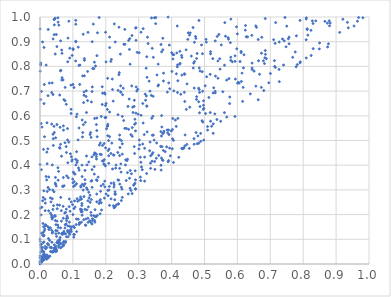
| Category | Series 0 |
|---|---|
| 0.07771794517160956 | 0.092 |
| 0.06074294028193955 | 0.086 |
| 0.6450709601239759 | 0.787 |
| 0.6847237936597033 | 0.994 |
| 0.08099568890269208 | 0.175 |
| 0.08514349919642825 | 0.915 |
| 0.025799441185664927 | 0.026 |
| 0.4145159997786562 | 0.77 |
| 0.5925951288202875 | 0.597 |
| 0.49307725375003175 | 0.778 |
| 0.24237287379751546 | 0.323 |
| 0.023870071170975865 | 0.466 |
| 0.06263583920901782 | 0.904 |
| 0.2908583154916927 | 0.304 |
| 0.24719032060894935 | 0.257 |
| 0.28681410300656623 | 0.663 |
| 0.25096911321135656 | 0.685 |
| 0.13282006722842943 | 0.18 |
| 0.8090279346385141 | 0.908 |
| 0.014582478561518585 | 0.141 |
| 0.25779008036873496 | 0.95 |
| 0.0701783342925036 | 0.087 |
| 0.061128077026876386 | 0.553 |
| 0.22933120541348714 | 0.283 |
| 0.6822958382141342 | 0.812 |
| 0.0894987998038751 | 0.133 |
| 0.2452397143179568 | 0.721 |
| 0.03910000964928657 | 0.129 |
| 0.12479755337448795 | 0.217 |
| 0.07646468307898636 | 0.715 |
| 0.04956767765553358 | 0.06 |
| 0.048104040195846506 | 0.06 |
| 0.30078739836975715 | 0.466 |
| 0.08430548199587273 | 0.134 |
| 0.010231933842358947 | 0.025 |
| 0.15475177297115605 | 0.209 |
| 0.22343150726191183 | 0.441 |
| 0.3519888541799515 | 0.998 |
| 0.013160806273815216 | 0.727 |
| 0.23974399773564367 | 0.766 |
| 0.34106295820876875 | 0.873 |
| 0.28851906456230514 | 0.586 |
| 0.15829432648563949 | 0.311 |
| 0.5326616762704381 | 0.903 |
| 0.4312412971049627 | 0.765 |
| 0.2897377193762897 | 0.304 |
| 0.3692653472762962 | 0.429 |
| 0.15427038501381404 | 0.168 |
| 0.1170654224397637 | 0.389 |
| 0.4841708892310961 | 0.794 |
| 0.7900441353425697 | 0.814 |
| 0.271873395746338 | 0.869 |
| 0.18967618542968437 | 0.417 |
| 0.10409934646162415 | 0.333 |
| 0.4441371893201989 | 0.867 |
| 0.015109716271359873 | 0.262 |
| 0.043537256314069926 | 0.532 |
| 0.042562452439769506 | 0.292 |
| 0.4883391060238307 | 0.529 |
| 0.054505547591070985 | 0.39 |
| 0.7274150226119309 | 0.738 |
| 0.22245315544635924 | 0.659 |
| 0.039840382371500775 | 0.049 |
| 0.31366859402506053 | 0.953 |
| 0.06219879855623923 | 0.782 |
| 0.18606769741198773 | 0.248 |
| 0.3343526679261407 | 0.7 |
| 0.02381402629883385 | 0.024 |
| 0.02885524253502658 | 0.301 |
| 0.19719650741495162 | 0.402 |
| 0.8659275276293782 | 0.982 |
| 0.0018122623020956376 | 0.806 |
| 0.4002992298416866 | 0.855 |
| 2.5374732099011684e-05 | 0.101 |
| 0.08206378033074815 | 0.194 |
| 0.3737629490613239 | 0.419 |
| 0.4178683884943541 | 0.694 |
| 0.18343687040565534 | 0.26 |
| 0.0018642116358527354 | 0.003 |
| 0.06232287972101107 | 0.485 |
| 0.09060662901800144 | 0.12 |
| 0.15223651508205943 | 0.524 |
| 0.24637505635666643 | 0.372 |
| 0.37357774883448897 | 0.867 |
| 0.12598466225090163 | 0.263 |
| 0.9206433246219313 | 0.991 |
| 0.09155771954819807 | 0.214 |
| 0.2401657528221085 | 0.959 |
| 0.2906225556285509 | 0.57 |
| 0.0675035561262706 | 0.12 |
| 0.13672617597431672 | 0.341 |
| 0.6080060294964591 | 0.82 |
| 0.7370790127498139 | 0.911 |
| 0.03960689348643968 | 0.189 |
| 7.24115315688472e-05 | 0.403 |
| 0.324106128229704 | 0.366 |
| 0.8791789458443146 | 0.984 |
| 0.006125430537741739 | 0.554 |
| 0.5785977053293129 | 0.896 |
| 0.2894492978625962 | 0.377 |
| 0.2057168179602708 | 0.752 |
| 0.004210188806059984 | 0.08 |
| 0.1271771722504581 | 0.237 |
| 0.3586671842119306 | 0.721 |
| 0.16540340149235583 | 0.817 |
| 0.07137053527687849 | 0.542 |
| 0.46934183696584075 | 0.898 |
| 0.2254488311588633 | 0.32 |
| 0.0005231411249484815 | 0.781 |
| 0.7272926840977211 | 0.899 |
| 0.4553046574903851 | 0.635 |
| 0.18126331389791767 | 0.256 |
| 0.0300058892932536 | 0.032 |
| 0.8121090191753233 | 0.949 |
| 0.20080228107822706 | 0.818 |
| 0.1296500424922519 | 0.762 |
| 0.04330208390071113 | 0.99 |
| 0.6198994387071352 | 0.847 |
| 0.13653140985544368 | 0.221 |
| 0.08444369235965678 | 0.187 |
| 0.24186704671824485 | 0.439 |
| 0.40673053593521075 | 0.701 |
| 0.07764218767525448 | 0.123 |
| 0.8242108388043438 | 0.844 |
| 0.09561830262548737 | 0.15 |
| 0.004297389380419186 | 0.125 |
| 0.03218062941669747 | 0.205 |
| 0.13825516684738204 | 0.158 |
| 0.03903496364241031 | 0.299 |
| 0.0800028965733332 | 0.222 |
| 0.1279884020346455 | 0.197 |
| 0.02664283043526806 | 0.352 |
| 0.031716866241943205 | 0.268 |
| 0.10016213471356948 | 0.328 |
| 0.2374117420797657 | 0.703 |
| 0.19612990590698923 | 0.693 |
| 0.5174009401749693 | 0.613 |
| 0.46969386960016785 | 0.82 |
| 0.10862762794132301 | 0.971 |
| 0.11292581491592786 | 0.264 |
| 0.3361669980736264 | 0.387 |
| 0.10833590785664052 | 0.822 |
| 0.15132836498025895 | 0.175 |
| 0.27285491856775773 | 0.912 |
| 0.10319779711345485 | 0.224 |
| 0.15597615413171464 | 0.196 |
| 0.08380756741576341 | 0.502 |
| 0.37500464162037345 | 0.46 |
| 0.5938614226923732 | 0.749 |
| 0.055206157423616405 | 0.339 |
| 0.8236639024213177 | 0.946 |
| 0.10644545556295043 | 0.231 |
| 0.3181068039094391 | 0.433 |
| 0.3414347914207417 | 0.521 |
| 0.04456926993941331 | 0.066 |
| 0.6439605885889431 | 0.926 |
| 0.48472176399185934 | 0.612 |
| 0.07508871284850069 | 0.206 |
| 0.40399216167832974 | 0.83 |
| 0.19251731370333994 | 0.417 |
| 0.10003819345801117 | 0.2 |
| 0.6740551784490632 | 0.918 |
| 0.09336883532899472 | 0.136 |
| 0.964801170223846 | 0.983 |
| 0.3123192689519532 | 0.65 |
| 0.04913064145413675 | 0.316 |
| 0.48250340611096415 | 0.489 |
| 0.9814779035953203 | 0.997 |
| 0.43615840742143763 | 0.47 |
| 0.07101780527801364 | 0.35 |
| 0.12819064020476315 | 0.583 |
| 0.29717115905028957 | 0.707 |
| 0.47613236214048976 | 0.677 |
| 0.6247787226639506 | 0.966 |
| 0.010611157695849078 | 0.464 |
| 0.6446316338678989 | 0.794 |
| 0.3911841811569122 | 0.733 |
| 0.10083537084995738 | 0.868 |
| 0.11575086013095681 | 0.502 |
| 0.5093053675043655 | 0.556 |
| 0.015772165205265185 | 0.071 |
| 0.05644807711798796 | 0.084 |
| 0.03734858977105636 | 0.401 |
| 0.36830123155332556 | 0.38 |
| 2.1956225460756277e-05 | 0.027 |
| 0.5260813339637147 | 0.692 |
| 0.0003509158156742929 | 0.952 |
| 0.010830636375857468 | 0.114 |
| 0.6111346387703305 | 0.855 |
| 0.4739069090148077 | 0.913 |
| 0.4865000542904284 | 0.781 |
| 0.0670329197145895 | 0.754 |
| 0.24308499169211994 | 0.472 |
| 0.04759355832742595 | 0.511 |
| 0.07160188909020547 | 0.078 |
| 0.20464501305793556 | 0.626 |
| 0.2183363434638222 | 0.489 |
| 0.08051135907579289 | 0.11 |
| 0.020807477952920515 | 0.453 |
| 0.4021194570625414 | 0.466 |
| 0.6732732776943541 | 0.853 |
| 0.9370346638688912 | 0.956 |
| 0.18924825179902063 | 0.646 |
| 0.16842317416753994 | 0.447 |
| 0.2765128866752045 | 0.298 |
| 0.1979017651114152 | 0.688 |
| 0.02301557472646564 | 0.081 |
| 0.08445536237500709 | 0.154 |
| 0.040336460767856304 | 0.507 |
| 0.4388830792468657 | 0.77 |
| 0.05642983371208194 | 0.375 |
| 0.26228841009396997 | 0.338 |
| 0.279652297602444 | 0.925 |
| 0.767944960997353 | 0.837 |
| 0.04793695599235579 | 0.06 |
| 0.09482414580122389 | 0.252 |
| 0.12306459633295148 | 0.222 |
| 0.3406674066369046 | 0.416 |
| 0.5314088649288196 | 0.608 |
| 0.6580467114737175 | 0.958 |
| 0.10829207894981413 | 0.424 |
| 0.24187416606751624 | 0.505 |
| 0.19691416852555263 | 0.335 |
| 0.5677339208220485 | 0.595 |
| 0.04309352765939378 | 0.929 |
| 0.06517868671534456 | 0.174 |
| 0.18544641840308343 | 0.316 |
| 0.1538935334240768 | 0.532 |
| 0.015388287265706777 | 0.035 |
| 0.1325709004054277 | 0.654 |
| 0.32442182169444095 | 0.839 |
| 0.08013944516049808 | 0.183 |
| 0.5927724209496439 | 0.843 |
| 0.10173435395399631 | 0.152 |
| 0.10507449340400443 | 0.255 |
| 0.06693698963710754 | 0.122 |
| 0.6006862736330945 | 0.732 |
| 0.07048020140221421 | 0.233 |
| 0.12729079495975895 | 0.245 |
| 0.574377510628958 | 0.75 |
| 0.12386820031689555 | 0.316 |
| 0.39205402988297255 | 0.524 |
| 0.4190261275767221 | 0.589 |
| 0.680241729604829 | 0.702 |
| 0.3383402314945183 | 0.683 |
| 0.29029467727929176 | 0.341 |
| 0.22999987020627735 | 0.388 |
| 0.0026668493744544572 | 0.078 |
| 0.11975146168474929 | 0.167 |
| 0.002036962847386162 | 0.03 |
| 0.14274974124559886 | 0.401 |
| 0.3389094077474148 | 0.996 |
| 0.026305457171633177 | 0.147 |
| 0.035315307078367754 | 0.189 |
| 0.4171074622668801 | 0.964 |
| 0.05263932648453039 | 0.239 |
| 0.03968370479523262 | 0.686 |
| 0.17128711752585712 | 0.435 |
| 0.00855999046076124 | 0.051 |
| 0.3768025334165366 | 0.537 |
| 0.03558442542253086 | 0.566 |
| 0.36916798200754375 | 0.518 |
| 0.08113478648205107 | 0.357 |
| 0.14824238068279616 | 0.291 |
| 0.024418112257541973 | 0.681 |
| 0.7132372603426024 | 0.8 |
| 0.012007694637197404 | 0.089 |
| 0.4687271495110146 | 0.712 |
| 0.2371945578878892 | 0.604 |
| 0.04737641660120812 | 0.323 |
| 0.3180648709028709 | 0.336 |
| 0.11062090282033793 | 0.596 |
| 0.001882860947912881 | 0.048 |
| 0.3938951130008635 | 0.469 |
| 0.5021227367300529 | 0.721 |
| 0.968482056604477 | 0.998 |
| 0.44482117590037334 | 0.626 |
| 0.007954586309333172 | 0.067 |
| 0.2693732026560294 | 0.905 |
| 0.37525806742564843 | 0.531 |
| 0.002320943045742654 | 0.814 |
| 0.012201323757799849 | 0.042 |
| 0.031790561618948096 | 0.146 |
| 0.1125682413464168 | 0.607 |
| 0.5727915370758041 | 0.91 |
| 0.4850494015058875 | 0.695 |
| 0.10449540056289931 | 0.148 |
| 0.18635529527164685 | 0.443 |
| 0.0015869575852850602 | 0.226 |
| 0.11868361494841545 | 0.804 |
| 0.09678969439270589 | 0.416 |
| 0.1396407298217442 | 0.182 |
| 0.03915256522482721 | 0.221 |
| 0.05232287277804262 | 0.224 |
| 0.05023398100484154 | 0.112 |
| 0.06545083872374062 | 0.436 |
| 0.18038662954279494 | 0.481 |
| 0.0027503187326733186 | 0.015 |
| 0.19927585457964897 | 0.938 |
| 0.3677004224765184 | 0.4 |
| 0.5252473310781544 | 0.831 |
| 0.46570540180810616 | 0.793 |
| 0.0708528700932216 | 0.185 |
| 0.2204477622117087 | 0.706 |
| 0.710153432725008 | 0.908 |
| 0.614113921670022 | 0.773 |
| 0.001182415211174198 | 0.002 |
| 0.3407376638436963 | 0.445 |
| 0.07661894992028548 | 0.159 |
| 0.158711493120338 | 0.9 |
| 0.32322806783023167 | 0.68 |
| 0.6881899273582819 | 0.831 |
| 0.002310601845919211 | 0.004 |
| 0.06244398836361253 | 0.146 |
| 0.2658363673711462 | 0.37 |
| 0.005792793921394584 | 0.057 |
| 0.09781200738711203 | 0.844 |
| 0.3695691089118436 | 0.601 |
| 0.09053826185036062 | 0.834 |
| 0.20710655891081048 | 0.459 |
| 0.10855006028063127 | 0.902 |
| 0.1724819898294946 | 0.54 |
| 0.07943439753795564 | 0.162 |
| 0.36674108010016326 | 0.476 |
| 0.44691022009314735 | 0.729 |
| 0.08424248877955116 | 0.819 |
| 0.3396700845579861 | 0.59 |
| 0.023888543582625762 | 0.082 |
| 0.19008756767183305 | 0.48 |
| 0.27636360180613195 | 0.524 |
| 0.3601974106100851 | 0.725 |
| 0.004277538123667442 | 0.699 |
| 0.5327391553033922 | 0.693 |
| 0.6728030859986747 | 0.715 |
| 0.4059175273896763 | 0.411 |
| 0.5639460225254056 | 0.922 |
| 0.17133655840627923 | 0.565 |
| 0.39083680563365375 | 0.419 |
| 0.3364763418253606 | 0.438 |
| 0.009590725160732883 | 0.036 |
| 0.08413260000874671 | 0.136 |
| 0.5616720754593398 | 0.977 |
| 0.3445739442457565 | 0.522 |
| 0.35554192924021555 | 0.765 |
| 0.14570494529857686 | 0.256 |
| 0.15730177923077188 | 0.338 |
| 0.5046181448121406 | 0.91 |
| 0.5216811052285291 | 0.558 |
| 0.06275095617654923 | 0.081 |
| 0.0006177194400481178 | 0.033 |
| 0.1459197156321001 | 0.938 |
| 0.01006639610400599 | 0.128 |
| 0.20469670067822687 | 0.558 |
| 0.9108456967535148 | 0.938 |
| 0.18630671765259224 | 0.597 |
| 0.0033167154239257903 | 0.199 |
| 0.10859946146851626 | 0.986 |
| 0.39874318964012617 | 0.538 |
| 0.5031917847507708 | 0.609 |
| 0.006286656227087256 | 0.013 |
| 0.4681431359787495 | 0.508 |
| 0.3480162705677375 | 0.997 |
| 0.754963217511804 | 0.912 |
| 0.5172764385898274 | 0.768 |
| 0.02047363475848553 | 0.067 |
| 0.42569713199924275 | 0.812 |
| 0.15826047483935188 | 0.162 |
| 0.1953795829755433 | 0.423 |
| 0.07718266794911194 | 0.086 |
| 0.38044650475343894 | 0.455 |
| 0.2818084469272457 | 0.635 |
| 0.15533752675658324 | 0.335 |
| 0.0979767980758001 | 0.422 |
| 0.27379218326828586 | 0.307 |
| 0.02616665782120028 | 0.077 |
| 0.4307575732921429 | 0.468 |
| 0.19394406761097127 | 0.405 |
| 0.007130243457437693 | 0.013 |
| 0.03635738118504258 | 0.088 |
| 0.4943652860746295 | 0.699 |
| 0.750095659228512 | 0.963 |
| 0.21139702962002188 | 0.237 |
| 0.04956736885271304 | 0.929 |
| 0.5387602286688308 | 0.921 |
| 0.1276281326482849 | 0.4 |
| 0.2367201038428579 | 0.341 |
| 0.1798438242911299 | 0.998 |
| 0.6121628002972801 | 0.739 |
| 0.13383400423862551 | 0.683 |
| 0.08994404444164524 | 0.152 |
| 0.6183828723483474 | 0.794 |
| 0.1377091511440892 | 0.574 |
| 0.02094342356958703 | 0.037 |
| 0.6115345238896164 | 0.861 |
| 0.35353025038249464 | 0.428 |
| 0.4008927116089785 | 0.78 |
| 0.02150887210285034 | 0.026 |
| 0.17370818681036845 | 0.338 |
| 0.16876991245213635 | 0.801 |
| 0.25815845965627915 | 0.889 |
| 0.2605194993014375 | 0.422 |
| 0.013623359495657968 | 0.515 |
| 0.2918226608960388 | 0.905 |
| 0.38930390871741877 | 0.414 |
| 0.27993215148678025 | 0.285 |
| 0.12049663628603197 | 0.259 |
| 0.25298857815507736 | 0.712 |
| 0.47752360205844974 | 0.852 |
| 0.5183685190682834 | 0.851 |
| 0.15827547967998926 | 0.382 |
| 0.1603054674950383 | 0.791 |
| 0.065915660023578 | 0.866 |
| 0.3051837495414174 | 0.352 |
| 0.532257331373567 | 0.699 |
| 0.2392323506243427 | 0.339 |
| 0.04886161227397606 | 0.071 |
| 0.3864293717717975 | 0.543 |
| 0.37334130415812217 | 0.914 |
| 0.394417893238924 | 0.71 |
| 0.12084297454838465 | 0.727 |
| 0.010036108628372212 | 0.087 |
| 0.48216418299729835 | 0.712 |
| 0.10151052564545779 | 0.372 |
| 0.0628160331855416 | 0.065 |
| 0.09256082872366876 | 0.446 |
| 0.41402518505337016 | 0.557 |
| 0.07577889654491755 | 0.146 |
| 0.0511606338063712 | 0.086 |
| 0.2721524591648492 | 0.347 |
| 0.2779667709768717 | 0.365 |
| 0.8735427014526274 | 0.975 |
| 0.5797582617497172 | 0.825 |
| 0.19493897845553482 | 0.488 |
| 0.7445439056338101 | 0.998 |
| 0.027099313090699698 | 0.139 |
| 0.3072521027185678 | 0.602 |
| 0.10269275082513901 | 0.109 |
| 0.7819531038046406 | 0.807 |
| 0.38715791820731554 | 0.696 |
| 0.3591895150233644 | 0.809 |
| 0.023641265340301608 | 0.027 |
| 0.015729962247981313 | 0.216 |
| 0.007344667710516202 | 0.028 |
| 0.1090885004254288 | 0.401 |
| 0.011308022804807576 | 0.05 |
| 0.046185915309084426 | 0.995 |
| 0.017173005357230455 | 0.063 |
| 0.08770856821086806 | 0.494 |
| 0.1335409587731364 | 0.273 |
| 0.2543335452948726 | 0.581 |
| 0.418186157477565 | 0.806 |
| 0.04786552611967513 | 0.136 |
| 0.14421107532982946 | 0.301 |
| 0.3709462509531298 | 0.475 |
| 0.30493899855412404 | 0.432 |
| 0.8091641069961839 | 0.834 |
| 0.24743309115923678 | 0.5 |
| 0.018741527818379407 | 0.805 |
| 0.16464189005262 | 0.394 |
| 0.8095380233128914 | 0.997 |
| 0.16734244004707835 | 0.22 |
| 0.23875505998961005 | 0.243 |
| 0.3198048710864735 | 0.688 |
| 0.2829558441665148 | 0.613 |
| 0.7571170368931337 | 0.892 |
| 0.012156060842010015 | 0.649 |
| 0.4251885791615429 | 0.81 |
| 0.10048102809559832 | 0.872 |
| 0.6834611204954248 | 0.835 |
| 0.040548014160819386 | 0.48 |
| 0.16682012101348814 | 0.169 |
| 0.16641039008139855 | 0.45 |
| 0.009011329857562327 | 0.032 |
| 0.28865674653485074 | 0.327 |
| 0.056951522782292624 | 0.076 |
| 0.10900603874832372 | 0.9 |
| 0.2673582374892439 | 0.638 |
| 0.010771208396857832 | 0.016 |
| 0.5438558909545138 | 0.929 |
| 0.1264840231394486 | 0.22 |
| 0.13489334805501313 | 0.762 |
| 0.509333759003949 | 0.542 |
| 0.03731146843656649 | 0.264 |
| 0.35157208412652763 | 0.973 |
| 0.1062851746056243 | 0.364 |
| 0.4971733229444658 | 0.661 |
| 0.04369411279314922 | 0.078 |
| 0.16206200549898364 | 0.971 |
| 0.6789699605222785 | 0.823 |
| 0.5673628406573615 | 0.745 |
| 0.10186043954567124 | 0.314 |
| 0.3061682854899739 | 0.338 |
| 0.07029654663101609 | 0.745 |
| 0.001921518805181339 | 0.666 |
| 0.12814298849016292 | 0.354 |
| 0.11847088605269912 | 0.551 |
| 0.01203139367520658 | 0.016 |
| 0.24722322829192064 | 0.311 |
| 0.2442482866936793 | 0.85 |
| 0.02937964392033377 | 0.095 |
| 0.7125608848230843 | 0.823 |
| 0.31354135944484207 | 0.571 |
| 0.8304907237382896 | 0.872 |
| 0.06471972007108047 | 0.216 |
| 0.3179578113017107 | 0.469 |
| 0.3084905671203656 | 0.393 |
| 0.1286842096266799 | 0.323 |
| 0.17423503177424596 | 0.197 |
| 0.17175979702789024 | 0.425 |
| 0.1553453680472996 | 0.513 |
| 0.20601758317579966 | 0.559 |
| 4.888593798495144e-05 | 0 |
| 0.6642870934849785 | 0.823 |
| 0.441057693469153 | 0.522 |
| 0.18709637079953884 | 0.219 |
| 0.8299792209409124 | 0.974 |
| 0.2908289374770257 | 0.955 |
| 0.1461468778220493 | 0.169 |
| 0.17964250460362488 | 0.245 |
| 0.5409362413162245 | 0.752 |
| 0.2902854259664548 | 0.539 |
| 0.14582386168025377 | 0.185 |
| 0.4939474585247001 | 0.851 |
| 0.23122219445679174 | 0.401 |
| 0.25031679230403475 | 0.598 |
| 0.6671912077585455 | 0.768 |
| 0.5462169178438161 | 0.831 |
| 0.390707770923385 | 0.542 |
| 0.18406878592119652 | 0.294 |
| 0.21177609010418977 | 0.615 |
| 0.056894176770595814 | 0.125 |
| 0.7758029871921653 | 0.859 |
| 0.6054592962665665 | 0.732 |
| 0.4114839202110374 | 0.583 |
| 0.14145455306309607 | 0.308 |
| 0.20618432088484853 | 0.566 |
| 0.05087974334381143 | 0.052 |
| 0.051533972173124706 | 0.565 |
| 0.14134253865075005 | 0.613 |
| 0.6955007303417937 | 0.734 |
| 0.5056325882450925 | 0.898 |
| 0.49639880679697695 | 0.626 |
| 0.04258025079346173 | 0.557 |
| 0.3253721871894396 | 0.756 |
| 0.07788572300393982 | 0.209 |
| 0.13685973542741742 | 0.379 |
| 0.2865456780507758 | 0.475 |
| 0.46010230660319207 | 0.842 |
| 0.6508394232530778 | 0.781 |
| 0.49255107790418484 | 0.58 |
| 0.22797398895525942 | 0.292 |
| 0.2272850605301466 | 0.26 |
| 0.2058854583707813 | 0.52 |
| 0.6446388560394019 | 0.813 |
| 0.0370260167041533 | 0.733 |
| 0.06075786627220264 | 0.468 |
| 0.468449524405411 | 0.485 |
| 0.09949294910523784 | 0.344 |
| 0.334672442936964 | 0.494 |
| 0.0430024081878139 | 0.065 |
| 0.04355458384784078 | 0.968 |
| 0.615875492275342 | 0.658 |
| 0.006026449407181157 | 0.014 |
| 0.257884461367537 | 0.549 |
| 0.2804206211385586 | 0.552 |
| 0.20691521146203085 | 0.277 |
| 0.08039384199707911 | 0.451 |
| 0.0002083543016196539 | 0.006 |
| 0.007947680526550288 | 0.256 |
| 0.3121819045832866 | 0.486 |
| 0.6559478540786324 | 0.964 |
| 0.14928887154008105 | 0.267 |
| 0.059444934973806325 | 0.239 |
| 0.13128600816654118 | 0.93 |
| 0.04120814314640181 | 0.236 |
| 0.20095539006121024 | 0.65 |
| 0.043137313991045305 | 0.99 |
| 0.17168184455827112 | 0.341 |
| 0.16342021255722491 | 0.196 |
| 0.04649792613327757 | 0.327 |
| 0.4304098004329754 | 0.844 |
| 0.6631805996321114 | 0.909 |
| 0.25967048461445263 | 0.401 |
| 0.15617445808654443 | 0.261 |
| 0.06704192564451958 | 0.853 |
| 0.20220760556746464 | 0.547 |
| 0.8800461772341079 | 0.964 |
| 0.04472679813989335 | 0.196 |
| 0.19884258489309026 | 0.397 |
| 0.06900020426882586 | 0.315 |
| 0.09440636399533536 | 0.61 |
| 0.2920360759413662 | 0.957 |
| 0.024860212423049668 | 0.95 |
| 0.01649908916882606 | 0.158 |
| 0.27381600034351156 | 0.809 |
| 0.32435179966786204 | 0.639 |
| 0.09388352638521831 | 0.141 |
| 0.16746331565057676 | 0.192 |
| 0.12825692389429807 | 0.211 |
| 0.11118372947095977 | 0.325 |
| 0.18321337378970254 | 0.49 |
| 0.2548728684847286 | 0.89 |
| 0.14723305300595776 | 0.231 |
| 0.8820319648173969 | 0.976 |
| 0.01224150351539356 | 0.877 |
| 0.07945403032561987 | 0.475 |
| 0.513173192516932 | 0.674 |
| 0.3962358752112522 | 0.438 |
| 0.9344496289125779 | 0.978 |
| 0.2845706949742714 | 0.319 |
| 0.4970959749965678 | 0.643 |
| 0.08450977176136032 | 0.13 |
| 0.2162213017182207 | 0.327 |
| 0.34454015246522257 | 0.837 |
| 0.2501179172444035 | 0.27 |
| 0.42523906550449175 | 0.861 |
| 0.20002329256666768 | 0.594 |
| 0.32560984451206065 | 0.535 |
| 0.23792340635777032 | 0.244 |
| 0.1971852710138026 | 0.312 |
| 0.5065373927515986 | 0.758 |
| 0.7162418651697834 | 0.977 |
| 0.2922678422941008 | 0.717 |
| 0.21154402860523897 | 0.919 |
| 0.31689150557558093 | 0.524 |
| 0.7003781223241058 | 0.771 |
| 0.009078533059155952 | 0.164 |
| 0.2861689570594426 | 0.638 |
| 0.07252344560712334 | 0.121 |
| 0.024459581597588192 | 0.029 |
| 0.23645896507713474 | 0.452 |
| 0.028570980250113086 | 0.732 |
| 0.2914699767614594 | 0.611 |
| 0.14240803580221717 | 0.219 |
| 0.05141810920449669 | 0.88 |
| 0.3070794931928186 | 0.939 |
| 0.2100791299255372 | 0.466 |
| 0.5377097017300412 | 0.585 |
| 0.1444711028241662 | 0.662 |
| 0.03574363547323778 | 0.136 |
| 0.19024243711438812 | 0.691 |
| 0.33331170553056544 | 0.459 |
| 0.15949215667678757 | 0.183 |
| 0.17152310928189768 | 0.444 |
| 0.05172906889722762 | 0.174 |
| 0.4279284742766919 | 0.687 |
| 0.17230762541476705 | 0.283 |
| 0.07990369383959432 | 0.647 |
| 0.014632963651219914 | 0.032 |
| 0.03988898064392213 | 0.911 |
| 0.2420867587271064 | 0.522 |
| 0.37519343177205544 | 0.741 |
| 0.8741970376864797 | 0.879 |
| 0.10420677102574351 | 0.367 |
| 0.0027078639819382144 | 0.005 |
| 0.21174447389750997 | 0.876 |
| 0.07111020397941765 | 0.559 |
| 0.1957378858468897 | 0.267 |
| 0.3674135854408645 | 0.536 |
| 0.2094783051437657 | 0.299 |
| 0.5183857467621199 | 0.86 |
| 0.0013323289411841176 | 0.005 |
| 0.4977101688392451 | 0.502 |
| 0.08553611696659152 | 0.11 |
| 0.8118507888343266 | 0.952 |
| 0.1579984909703466 | 0.434 |
| 0.27880748814033746 | 0.721 |
| 0.08864213218589613 | 0.232 |
| 0.1413802245538494 | 0.437 |
| 0.3108802150906864 | 0.382 |
| 0.11476716634472556 | 0.254 |
| 0.0006268279357792042 | 0.092 |
| 0.2197210475388443 | 0.749 |
| 0.4949859652880272 | 0.575 |
| 0.017120244759704407 | 0.062 |
| 0.027968560837497578 | 0.032 |
| 0.36787255665266544 | 0.889 |
| 0.20626273459832328 | 0.298 |
| 0.593236008345691 | 0.82 |
| 0.418988983668842 | 0.742 |
| 0.04834705425419277 | 0.123 |
| 0.0598756031971469 | 0.684 |
| 0.7905314425343127 | 0.986 |
| 0.47795148384449526 | 0.487 |
| 0.3880341088721999 | 0.531 |
| 0.4406747286950369 | 0.478 |
| 0.04701444592537956 | 0.351 |
| 0.17382708357887613 | 0.515 |
| 0.0721893445839145 | 0.091 |
| 0.07271027667586417 | 0.666 |
| 0.8768274030971827 | 0.892 |
| 0.480002217460941 | 0.518 |
| 0.8090227143842484 | 0.992 |
| 0.3227625344938024 | 0.793 |
| 0.006626547492751786 | 0.019 |
| 0.03211967477959297 | 0.05 |
| 0.08359374480501564 | 0.548 |
| 0.47565661053945113 | 0.666 |
| 0.3732913559470281 | 0.528 |
| 0.06632695866272686 | 0.745 |
| 0.40562340893086934 | 0.501 |
| 0.010922915147900683 | 0.15 |
| 0.6023556967124919 | 0.736 |
| 0.06296549593807338 | 0.27 |
| 0.06970606315645829 | 0.313 |
| 0.576831882849333 | 0.676 |
| 0.13998451213474486 | 0.678 |
| 0.021690182457683758 | 0.406 |
| 0.002143986674723021 | 0.005 |
| 0.024400801965258463 | 0.31 |
| 0.8498960068477116 | 0.895 |
| 0.054544881501608064 | 0.997 |
| 0.24602276594238082 | 0.696 |
| 0.03549816105377673 | 0.694 |
| 0.010076574185618366 | 0.032 |
| 0.19938354593334598 | 0.47 |
| 0.13119632709869172 | 0.299 |
| 0.32512078652663023 | 0.64 |
| 0.08764611812852763 | 0.983 |
| 0.08927637580184268 | 0.169 |
| 0.08862844552435024 | 0.125 |
| 0.5491633827560145 | 0.578 |
| 0.34685984107100243 | 0.502 |
| 0.03959222153822068 | 0.525 |
| 0.4462765067149399 | 0.484 |
| 0.3267214724649325 | 0.918 |
| 0.42192716895257926 | 0.432 |
| 0.12086845981567237 | 0.165 |
| 0.4864688449952069 | 0.637 |
| 0.017421889111350775 | 0.158 |
| 0.34935334115174166 | 0.383 |
| 0.439980657557371 | 0.658 |
| 0.7785703351529347 | 0.799 |
| 0.09456863950932654 | 0.626 |
| 0.19926370389247094 | 0.593 |
| 0.06979565379273843 | 0.125 |
| 0.020224617940873057 | 0.34 |
| 0.016285640647113513 | 0.247 |
| 0.03688937301763747 | 0.125 |
| 0.1318206810265922 | 0.564 |
| 0.9546206959055893 | 0.964 |
| 0.5281030329298216 | 0.713 |
| 0.0947949757560995 | 0.131 |
| 0.4338398078870862 | 0.466 |
| 0.7911743109371341 | 0.818 |
| 0.5763698150473784 | 0.649 |
| 0.3893644660094015 | 1 |
| 0.08592217327257796 | 0.349 |
| 0.05955054497973205 | 0.096 |
| 0.01539151826490772 | 0.031 |
| 0.33582627673271837 | 0.408 |
| 0.15903057614489385 | 0.717 |
| 0.10341147390533069 | 0.714 |
| 0.5408028119434098 | 0.822 |
| 0.018878854404603733 | 0.024 |
| 0.8141489683928976 | 0.927 |
| 0.11235487441035473 | 0.411 |
| 0.2941827557278421 | 0.7 |
| 0.4374690763291214 | 0.47 |
| 0.018622997143549803 | 0.354 |
| 0.3703592002906653 | 0.555 |
| 0.40281236337157994 | 0.507 |
| 0.5719100852775149 | 0.916 |
| 0.4885118219636524 | 0.497 |
| 0.3317351994863942 | 0.74 |
| 0.1636106946033059 | 0.791 |
| 0.7403203725239267 | 0.806 |
| 0.17092163796055204 | 0.192 |
| 0.45669522096247744 | 0.936 |
| 0.003561338042186029 | 0.005 |
| 0.09537483964796793 | 0.434 |
| 0.22785752127620248 | 0.282 |
| 0.2160334464635424 | 0.264 |
| 0.022056053444924107 | 0.294 |
| 0.06334458496776717 | 0.784 |
| 0.1655263752539711 | 0.177 |
| 0.07599123810770014 | 0.661 |
| 0.3849755740623128 | 0.474 |
| 0.04657691074144631 | 0.176 |
| 0.03539047742625566 | 0.198 |
| 0.21521182252759857 | 0.82 |
| 0.16610726320769723 | 0.589 |
| 0.008578794540171814 | 0.115 |
| 0.24214011612724806 | 0.387 |
| 0.8382156824738513 | 0.984 |
| 0.5332808831404461 | 0.761 |
| 0.1766145996837891 | 0.352 |
| 0.5846756047613381 | 0.819 |
| 0.2245214302019639 | 0.329 |
| 0.43137111262185546 | 0.836 |
| 0.08897197297521342 | 0.263 |
| 0.07583131133682963 | 0.491 |
| 0.2876428200664537 | 0.447 |
| 0.21151290499958225 | 0.516 |
| 0.12581779664409798 | 0.169 |
| 0.038238026545898016 | 0.048 |
| 0.009742140764089153 | 0.27 |
| 0.021259816915687416 | 0.572 |
| 0.23173432427967944 | 0.239 |
| 0.15209680761657418 | 0.278 |
| 0.052896133413947076 | 0.088 |
| 0.005760253498234499 | 0.23 |
| 0.14073905245366214 | 0.701 |
| 0.10253174817468359 | 0.12 |
| 0.5972827977340764 | 0.96 |
| 0.012162298284649034 | 0.117 |
| 0.2286003115281709 | 0.899 |
| 0.32093179322898036 | 0.663 |
| 0.6391885250918032 | 0.689 |
| 0.26439605167262686 | 0.419 |
| 0.726730940377576 | 0.788 |
| 0.3720339832513727 | 0.422 |
| 0.013104604304221943 | 0.135 |
| 0.684742323743084 | 0.864 |
| 0.19775119258364438 | 0.592 |
| 0.47422513952212964 | 0.532 |
| 0.6632988902505766 | 0.665 |
| 0.3431615844935508 | 0.598 |
| 0.05502038932896822 | 0.979 |
| 0.47250427052141675 | 0.921 |
| 0.4979016181074737 | 0.63 |
| 0.24902746059451483 | 0.303 |
| 0.4067681004642533 | 0.847 |
| 0.3286651297349466 | 0.893 |
| 0.20060858408954338 | 0.284 |
| 0.1349814266571296 | 0.832 |
| 0.04842903709682764 | 0.159 |
| 0.019503640840608613 | 0.02 |
| 0.5980105058291512 | 0.871 |
| 0.09408749292208153 | 0.724 |
| 0.2693343220571506 | 0.545 |
| 0.295410615153255 | 0.857 |
| 0.05953307987179751 | 0.472 |
| 0.2864809509080025 | 0.322 |
| 0.11121961792052541 | 0.455 |
| 0.4538541844675993 | 0.468 |
| 0.6561975407963698 | 0.72 |
| 0.48394333804377276 | 0.706 |
| 0.2156045124320024 | 0.448 |
| 0.8278102478314014 | 0.984 |
| 0.30274690829635925 | 0.482 |
| 0.12439757983344735 | 0.311 |
| 0.375578096583402 | 0.773 |
| 0.19909610721293705 | 0.642 |
| 0.21712555823380925 | 0.828 |
| 0.01902665302689464 | 0.027 |
| 0.15243121697556417 | 0.249 |
| 0.033798250082503443 | 0.068 |
| 0.2106896855769904 | 0.314 |
| 0.580221216396357 | 0.991 |
| 0.6175308379746175 | 0.715 |
| 0.5556798052979727 | 0.697 |
| 0.1187997503068347 | 0.16 |
| 0.6310292954343325 | 0.919 |
| 0.560467828006366 | 0.613 |
| 0.5184967935993152 | 0.578 |
| 0.026294828539216067 | 0.215 |
| 0.3696006482941181 | 0.859 |
| 0.4038077717412853 | 0.848 |
| 0.25012795957702444 | 0.445 |
| 0.11138955243793251 | 0.131 |
| 0.034820729208020526 | 0.065 |
| 0.002133988495490231 | 0.077 |
| 0.848993715653067 | 0.871 |
| 0.033404682841662356 | 0.251 |
| 0.44924651570536595 | 0.91 |
| 0.274259629788718 | 0.379 |
| 0.1298383447378821 | 0.532 |
| 0.03682211223709939 | 0.182 |
| 0.6852712714278182 | 0.849 |
| 0.24513262711586584 | 0.696 |
| 0.12512997434097625 | 0.211 |
| 0.05737750559974808 | 0.967 |
| 0.003472085407275256 | 0.569 |
| 0.4823043971831905 | 0.657 |
| 0.11082034485167257 | 0.182 |
| 0.7154731410839619 | 0.796 |
| 0.24576555536339478 | 0.405 |
| 0.11620414987762913 | 0.878 |
| 0.5266128908551126 | 0.567 |
| 0.7147170183028183 | 0.893 |
| 0.1390966449484417 | 0.156 |
| 0.20846131526588338 | 0.5 |
| 0.5799142023548126 | 0.837 |
| 0.10995630661162861 | 0.16 |
| 0.7424548544150757 | 0.903 |
| 0.3484471631103244 | 0.415 |
| 0.7479483024378254 | 0.879 |
| 0.22502057922722696 | 0.228 |
| 0.023535038480404724 | 0.151 |
| 0.15935001707916932 | 0.175 |
| 0.17308192571343217 | 0.844 |
| 0.17264650566964226 | 0.252 |
| 0.10462788206305977 | 0.12 |
| 0.03115371385679363 | 0.067 |
| 0.25013695044539136 | 0.486 |
| 0.402566895079582 | 0.544 |
| 0.04664602114452703 | 0.194 |
| 0.39304895741346735 | 0.886 |
| 0.41730853255439704 | 0.798 |
| 0.05182260111702216 | 0.135 |
| 0.010946364286384737 | 0.025 |
| 0.182609608638786 | 0.445 |
| 0.11890795673304169 | 0.38 |
| 0.6270525568439708 | 0.92 |
| 0.10677868174442985 | 0.319 |
| 0.34376677308448317 | 0.679 |
| 0.12322302634547809 | 0.271 |
| 0.0725828969244059 | 0.132 |
| 0.09061057437274543 | 0.873 |
| 0.2659149098058509 | 0.424 |
| 0.6238801316256882 | 0.947 |
| 0.4543745228939641 | 0.927 |
| 0.15634814311695058 | 0.656 |
| 0.04504229990809779 | 0.062 |
| 0.0553228547368119 | 0.148 |
| 0.003116494806185457 | 0.067 |
| 0.01714751625671775 | 0.154 |
| 0.1921673880427272 | 0.323 |
| 0.30667731312735524 | 0.412 |
| 0.1351104689095455 | 0.825 |
| 0.16411872636098163 | 0.443 |
| 0.30145153556067916 | 0.855 |
| 0.1650474839420499 | 0.364 |
| 0.27105831787592727 | 0.668 |
| 0.2090242203770764 | 0.438 |
| 0.29828647398640357 | 0.606 |
| 0.05439484144275306 | 0.158 |
| 0.11648028304409018 | 0.181 |
| 0.17465860344899323 | 0.936 |
| 0.2204062349844835 | 0.384 |
| 0.014559477048577562 | 0.031 |
| 0.22331837769655616 | 0.236 |
| 0.3545884784558368 | 0.49 |
| 0.44000158238254516 | 0.768 |
| 0.5509562945281259 | 0.887 |
| 0.1332949006485621 | 0.317 |
| 0.4910031497825967 | 0.887 |
| 0.06732575122985116 | 0.07 |
| 0.4671773156913593 | 0.813 |
| 0.01174612408679215 | 0.296 |
| 0.06133690039012154 | 0.107 |
| 0.47595481148246455 | 0.832 |
| 0.18914927818951396 | 0.717 |
| 0.00010446704952431766 | 0.01 |
| 0.12913769023623803 | 0.515 |
| 0.5608538559572728 | 0.805 |
| 0.5263990070034196 | 0.529 |
| 0.2089932600775485 | 0.408 |
| 0.22857764555316043 | 0.232 |
| 0.041846444715165076 | 0.053 |
| 0.059385831463346916 | 0.1 |
| 0.7569783376201525 | 0.919 |
| 0.007721250851663029 | 0.899 |
| 0.40362318504905287 | 0.589 |
| 0.14477613059220926 | 0.78 |
| 0.3609656076487389 | 0.439 |
| 0.057165077147502956 | 0.068 |
| 0.1135854296732564 | 0.418 |
| 0.287545495854755 | 0.565 |
| 0.09897803217890612 | 0.24 |
| 0.10030214112686546 | 0.727 |
| 0.06612073869684568 | 0.123 |
| 0.34309982736814354 | 0.451 |
| 0.12149370537602999 | 0.806 |
| 0.2682200667633982 | 0.284 |
| 0.0017460840734151513 | 0.022 |
| 0.047362519966648906 | 0.05 |
| 0.4386752722351849 | 0.695 |
| 0.3018983990703725 | 0.502 |
| 0.45063273060715003 | 0.936 |
| 0.02578470094166443 | 0.103 |
| 0.5999224702750005 | 0.932 |
| 0.07332427659097591 | 0.317 |
| 0.004073749957592955 | 0.382 |
| 0.03554001002211899 | 0.049 |
| 0.4830269507048485 | 0.986 |
| 0.4653219920123972 | 0.957 |
| 0.17277350501480745 | 0.591 |
| 0.1367787603657571 | 0.325 |
| 0.2249761495407819 | 0.441 |
| 0.2249029762604578 | 0.311 |
| 0.07129031684510395 | 0.075 |
| 0.5473102144246238 | 0.789 |
| 0.15825301779883355 | 0.698 |
| 0.07193115763887019 | 0.125 |
| 0.2626198445126863 | 0.549 |
| 0.04628297352951149 | 0.85 |
| 0.22584266139871045 | 0.972 |
| 0.28050778446464436 | 0.517 |
| 0.04312060440912881 | 0.056 |
| 0.18261337989053625 | 0.203 |
| 0.41583410335844584 | 0.855 |
| 0.24111170793586328 | 0.775 |
| 0.054382702239407374 | 0.094 |
| 0.7793158479672981 | 0.924 |
| 0.08464698271434346 | 0.41 |
| 0.02060679050572448 | 0.021 |
| 0.14839681922285977 | 0.413 |
| 0.13384862076297963 | 0.696 |